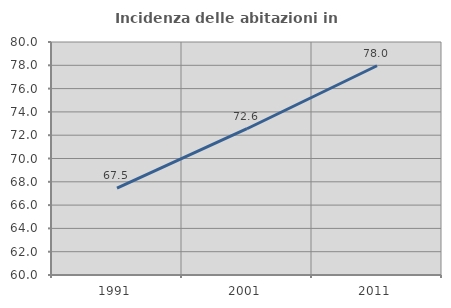
| Category | Incidenza delle abitazioni in proprietà  |
|---|---|
| 1991.0 | 67.463 |
| 2001.0 | 72.555 |
| 2011.0 | 77.963 |